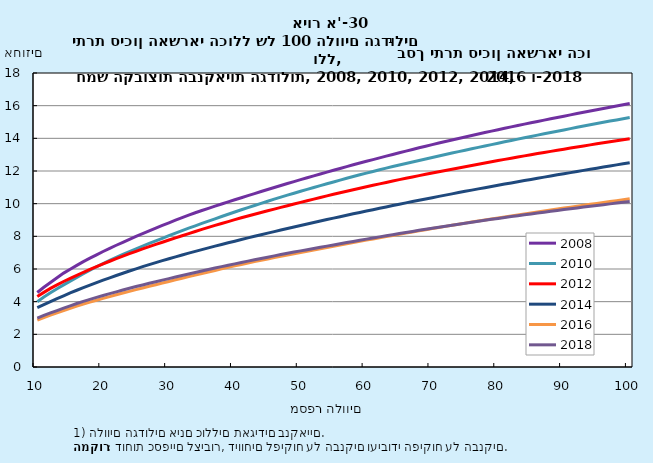
| Category | 2008 | 2010 | 2012 | 2014 | 2016 | 2018 |
|---|---|---|---|---|---|---|
| 10.0 | 4.561 | 3.999 | 4.322 | 3.634 | 2.866 | 2.998 |
| 11.0 | 4.881 | 4.282 | 4.569 | 3.819 | 3.031 | 3.158 |
| 12.0 | 5.178 | 4.539 | 4.811 | 4.003 | 3.179 | 3.309 |
| 13.0 | 5.467 | 4.791 | 5.031 | 4.185 | 3.321 | 3.457 |
| 14.0 | 5.747 | 5.026 | 5.233 | 4.361 | 3.458 | 3.604 |
| 15.0 | 5.988 | 5.26 | 5.432 | 4.537 | 3.592 | 3.746 |
| 16.0 | 6.223 | 5.49 | 5.617 | 4.698 | 3.725 | 3.888 |
| 17.0 | 6.453 | 5.71 | 5.801 | 4.858 | 3.857 | 4.018 |
| 18.0 | 6.662 | 5.924 | 5.974 | 5.014 | 3.974 | 4.141 |
| 19.0 | 6.869 | 6.137 | 6.143 | 5.169 | 4.088 | 4.264 |
| 20.0 | 7.073 | 6.333 | 6.309 | 5.315 | 4.201 | 4.378 |
| 21.0 | 7.266 | 6.523 | 6.474 | 5.458 | 4.311 | 4.49 |
| 22.0 | 7.454 | 6.713 | 6.634 | 5.601 | 4.42 | 4.601 |
| 23.0 | 7.634 | 6.901 | 6.788 | 5.742 | 4.527 | 4.71 |
| 24.0 | 7.813 | 7.071 | 6.938 | 5.879 | 4.632 | 4.818 |
| 25.0 | 7.991 | 7.238 | 7.083 | 6.01 | 4.735 | 4.925 |
| 26.0 | 8.166 | 7.4 | 7.227 | 6.141 | 4.839 | 5.024 |
| 27.0 | 8.34 | 7.562 | 7.37 | 6.268 | 4.941 | 5.124 |
| 28.0 | 8.507 | 7.722 | 7.505 | 6.393 | 5.04 | 5.221 |
| 29.0 | 8.668 | 7.881 | 7.64 | 6.511 | 5.14 | 5.317 |
| 30.0 | 8.828 | 8.039 | 7.774 | 6.628 | 5.239 | 5.413 |
| 31.0 | 8.986 | 8.196 | 7.907 | 6.744 | 5.337 | 5.508 |
| 32.0 | 9.14 | 8.349 | 8.039 | 6.859 | 5.435 | 5.603 |
| 33.0 | 9.293 | 8.497 | 8.169 | 6.97 | 5.531 | 5.696 |
| 34.0 | 9.443 | 8.645 | 8.298 | 7.081 | 5.627 | 5.788 |
| 35.0 | 9.579 | 8.79 | 8.424 | 7.189 | 5.723 | 5.881 |
| 36.0 | 9.714 | 8.932 | 8.549 | 7.294 | 5.817 | 5.972 |
| 37.0 | 9.848 | 9.074 | 8.668 | 7.398 | 5.912 | 6.061 |
| 38.0 | 9.978 | 9.214 | 8.786 | 7.501 | 6.006 | 6.147 |
| 39.0 | 10.108 | 9.354 | 8.904 | 7.603 | 6.098 | 6.232 |
| 40.0 | 10.238 | 9.492 | 9.02 | 7.704 | 6.189 | 6.315 |
| 41.0 | 10.365 | 9.628 | 9.135 | 7.804 | 6.28 | 6.399 |
| 42.0 | 10.491 | 9.761 | 9.244 | 7.903 | 6.371 | 6.482 |
| 43.0 | 10.617 | 9.89 | 9.352 | 8.002 | 6.453 | 6.563 |
| 44.0 | 10.743 | 10.019 | 9.458 | 8.1 | 6.534 | 6.644 |
| 45.0 | 10.867 | 10.148 | 9.563 | 8.195 | 6.616 | 6.724 |
| 46.0 | 10.991 | 10.276 | 9.668 | 8.29 | 6.697 | 6.804 |
| 47.0 | 11.113 | 10.4 | 9.773 | 8.385 | 6.777 | 6.884 |
| 48.0 | 11.233 | 10.521 | 9.877 | 8.479 | 6.855 | 6.96 |
| 49.0 | 11.352 | 10.641 | 9.98 | 8.573 | 6.934 | 7.035 |
| 50.0 | 11.47 | 10.76 | 10.08 | 8.667 | 7.012 | 7.108 |
| 51.0 | 11.586 | 10.876 | 10.179 | 8.759 | 7.09 | 7.182 |
| 52.0 | 11.701 | 10.99 | 10.278 | 8.85 | 7.167 | 7.255 |
| 53.0 | 11.816 | 11.104 | 10.377 | 8.939 | 7.243 | 7.328 |
| 54.0 | 11.93 | 11.218 | 10.475 | 9.028 | 7.319 | 7.401 |
| 55.0 | 12.044 | 11.33 | 10.572 | 9.116 | 7.395 | 7.473 |
| 56.0 | 12.157 | 11.443 | 10.669 | 9.204 | 7.47 | 7.545 |
| 57.0 | 12.27 | 11.552 | 10.762 | 9.291 | 7.545 | 7.617 |
| 58.0 | 12.379 | 11.661 | 10.855 | 9.377 | 7.62 | 7.688 |
| 59.0 | 12.486 | 11.767 | 10.947 | 9.463 | 7.695 | 7.759 |
| 60.0 | 12.593 | 11.87 | 11.037 | 9.548 | 7.768 | 7.829 |
| 61.0 | 12.699 | 11.972 | 11.124 | 9.633 | 7.841 | 7.898 |
| 62.0 | 12.805 | 12.075 | 11.212 | 9.717 | 7.913 | 7.966 |
| 63.0 | 12.909 | 12.176 | 11.299 | 9.801 | 7.985 | 8.035 |
| 64.0 | 13.013 | 12.273 | 11.385 | 9.885 | 8.057 | 8.103 |
| 65.0 | 13.116 | 12.367 | 11.471 | 9.967 | 8.129 | 8.17 |
| 66.0 | 13.218 | 12.46 | 11.554 | 10.047 | 8.2 | 8.236 |
| 67.0 | 13.32 | 12.553 | 11.636 | 10.128 | 8.27 | 8.302 |
| 68.0 | 13.421 | 12.645 | 11.717 | 10.208 | 8.34 | 8.367 |
| 69.0 | 13.519 | 12.736 | 11.797 | 10.287 | 8.408 | 8.431 |
| 70.0 | 13.617 | 12.828 | 11.877 | 10.367 | 8.476 | 8.494 |
| 71.0 | 13.713 | 12.919 | 11.956 | 10.446 | 8.543 | 8.556 |
| 72.0 | 13.808 | 13.008 | 12.034 | 10.523 | 8.611 | 8.618 |
| 73.0 | 13.901 | 13.097 | 12.111 | 10.601 | 8.677 | 8.68 |
| 74.0 | 13.992 | 13.185 | 12.187 | 10.678 | 8.743 | 8.741 |
| 75.0 | 14.084 | 13.274 | 12.263 | 10.754 | 8.808 | 8.802 |
| 76.0 | 14.174 | 13.36 | 12.339 | 10.83 | 8.872 | 8.863 |
| 77.0 | 14.264 | 13.446 | 12.414 | 10.905 | 8.936 | 8.923 |
| 78.0 | 14.352 | 13.532 | 12.489 | 10.979 | 9 | 8.982 |
| 79.0 | 14.44 | 13.617 | 12.564 | 11.053 | 9.063 | 9.04 |
| 80.0 | 14.527 | 13.702 | 12.638 | 11.126 | 9.126 | 9.097 |
| 81.0 | 14.614 | 13.786 | 12.712 | 11.199 | 9.189 | 9.153 |
| 82.0 | 14.7 | 13.869 | 12.783 | 11.271 | 9.252 | 9.209 |
| 83.0 | 14.785 | 13.951 | 12.855 | 11.343 | 9.314 | 9.264 |
| 84.0 | 14.869 | 14.034 | 12.925 | 11.415 | 9.376 | 9.318 |
| 85.0 | 14.953 | 14.115 | 12.996 | 11.485 | 9.437 | 9.372 |
| 86.0 | 15.035 | 14.196 | 13.066 | 11.556 | 9.496 | 9.426 |
| 87.0 | 15.116 | 14.276 | 13.135 | 11.626 | 9.555 | 9.479 |
| 88.0 | 15.197 | 14.356 | 13.203 | 11.695 | 9.614 | 9.533 |
| 89.0 | 15.277 | 14.436 | 13.27 | 11.764 | 9.672 | 9.585 |
| 90.0 | 15.357 | 14.516 | 13.337 | 11.833 | 9.73 | 9.637 |
| 91.0 | 15.436 | 14.595 | 13.403 | 11.902 | 9.788 | 9.688 |
| 92.0 | 15.515 | 14.673 | 13.469 | 11.97 | 9.846 | 9.739 |
| 93.0 | 15.594 | 14.751 | 13.534 | 12.038 | 9.902 | 9.79 |
| 94.0 | 15.672 | 14.828 | 13.599 | 12.106 | 9.959 | 9.84 |
| 95.0 | 15.75 | 14.905 | 13.663 | 12.174 | 10.015 | 9.889 |
| 96.0 | 15.827 | 14.981 | 13.726 | 12.241 | 10.071 | 9.939 |
| 97.0 | 15.904 | 15.055 | 13.789 | 12.308 | 10.128 | 9.988 |
| 98.0 | 15.98 | 15.128 | 13.851 | 12.374 | 10.184 | 10.037 |
| 99.0 | 16.056 | 15.2 | 13.914 | 12.44 | 10.239 | 10.085 |
| 100.0 | 16.131 | 15.271 | 13.976 | 12.506 | 10.295 | 10.134 |